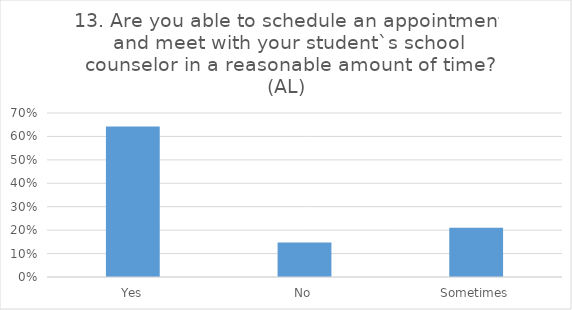
| Category | 13. Are you able to schedule an appointment and meet with your student`s school counselor in a reasonable amount of time? (AL) |
|---|---|
| Yes | 0.642 |
| No | 0.147 |
| Sometimes | 0.211 |